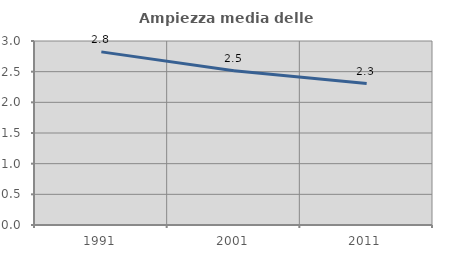
| Category | Ampiezza media delle famiglie |
|---|---|
| 1991.0 | 2.823 |
| 2001.0 | 2.516 |
| 2011.0 | 2.305 |